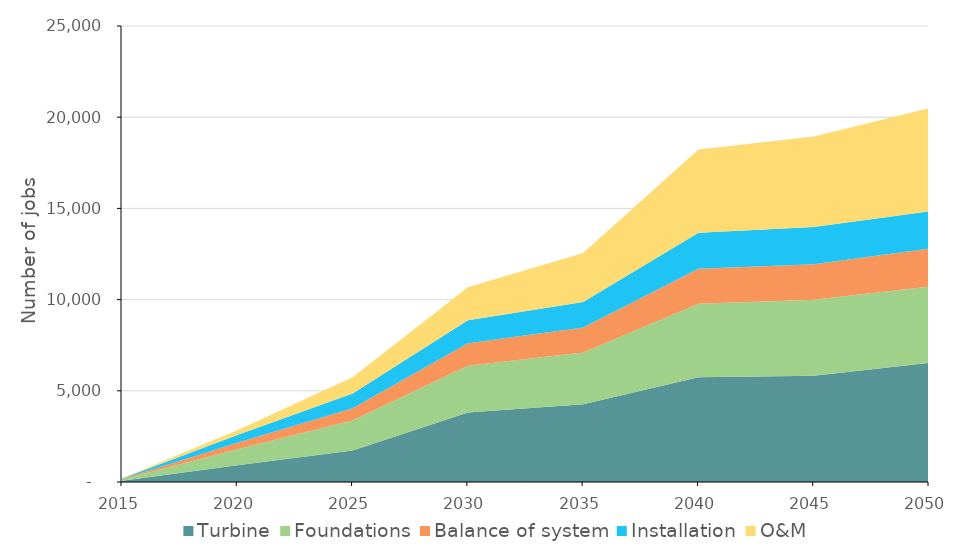
| Category | Turbine | Foundations | Balance of system | Installation | O&M  |
|---|---|---|---|---|---|
| 2015.0 | 65.357 | 66.124 | 27.584 | 32.441 | 15.455 |
| 2020.0 | 912.347 | 878.684 | 354.329 | 431.086 | 267.142 |
| 2025.0 | 1729.357 | 1638.425 | 679.312 | 803.818 | 894.341 |
| 2030.0 | 3810.678 | 2556.359 | 1241.608 | 1254.16 | 1815.146 |
| 2035.0 | 4266.188 | 2828.492 | 1382.537 | 1387.67 | 2689.928 |
| 2040.0 | 5737.516 | 4036.231 | 1911.342 | 1980.192 | 4568.74 |
| 2045.0 | 5825.481 | 4160.619 | 1954.639 | 2041.217 | 4956.017 |
| 2050.0 | 6525.611 | 4182.032 | 2082.404 | 2051.723 | 5647.802 |